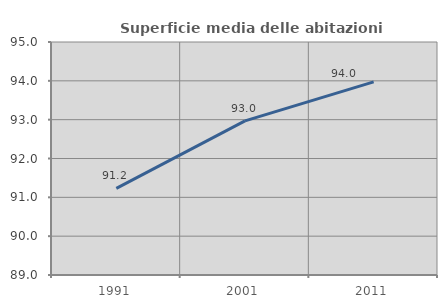
| Category | Superficie media delle abitazioni occupate |
|---|---|
| 1991.0 | 91.233 |
| 2001.0 | 92.969 |
| 2011.0 | 93.974 |